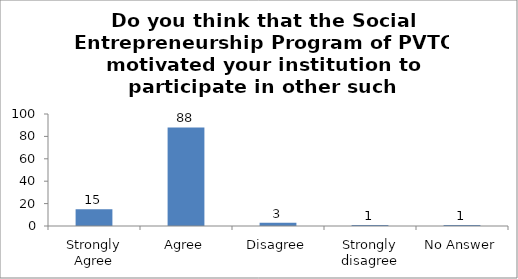
| Category | Do you think that the Social Entrepreneurship program of PVTC motivated your institution to participate in other such program(s)? |
|---|---|
| Strongly Agree | 15 |
| Agree | 88 |
| Disagree | 3 |
| Strongly disagree | 1 |
| No Answer | 1 |